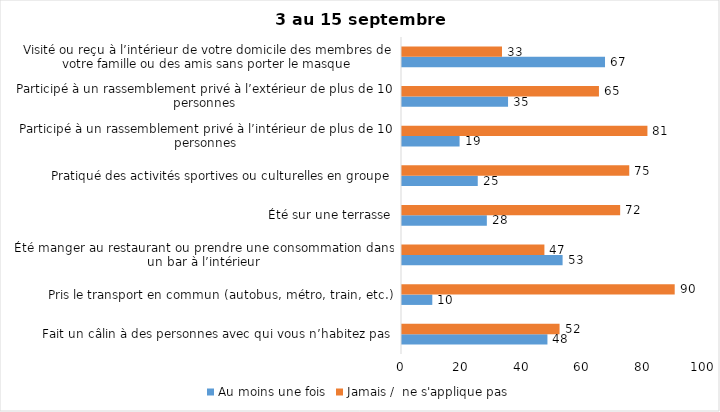
| Category | Au moins une fois | Jamais /  ne s'applique pas |
|---|---|---|
| Fait un câlin à des personnes avec qui vous n’habitez pas | 48 | 52 |
| Pris le transport en commun (autobus, métro, train, etc.) | 10 | 90 |
| Été manger au restaurant ou prendre une consommation dans un bar à l’intérieur | 53 | 47 |
| Été sur une terrasse | 28 | 72 |
| Pratiqué des activités sportives ou culturelles en groupe | 25 | 75 |
| Participé à un rassemblement privé à l’intérieur de plus de 10 personnes | 19 | 81 |
| Participé à un rassemblement privé à l’extérieur de plus de 10 personnes | 35 | 65 |
| Visité ou reçu à l’intérieur de votre domicile des membres de votre famille ou des amis sans porter le masque | 67 | 33 |